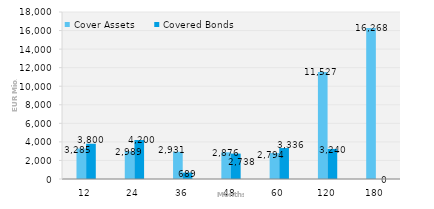
| Category | Cover Assets | Covered Bonds |
|---|---|---|
| 12.0 | 3285.09 | 3800 |
| 24.0 | 2989.456 | 4200 |
| 36.0 | 2930.939 | 689.444 |
| 48.0 | 2875.906 | 2738 |
| 60.0 | 2793.929 | 3336.41 |
| 120.0 | 11527.453 | 3240 |
| 180.0 | 16267.699 | 0 |